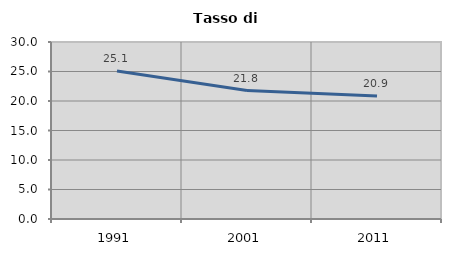
| Category | Tasso di disoccupazione   |
|---|---|
| 1991.0 | 25.083 |
| 2001.0 | 21.77 |
| 2011.0 | 20.855 |